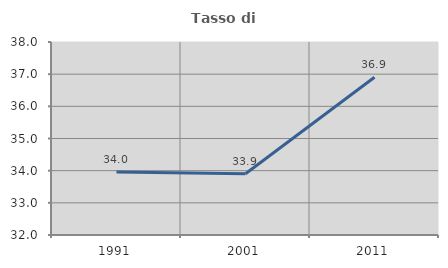
| Category | Tasso di occupazione   |
|---|---|
| 1991.0 | 33.961 |
| 2001.0 | 33.903 |
| 2011.0 | 36.906 |